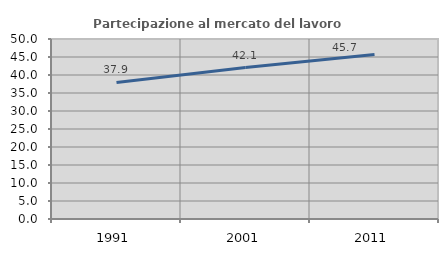
| Category | Partecipazione al mercato del lavoro  femminile |
|---|---|
| 1991.0 | 37.917 |
| 2001.0 | 42.06 |
| 2011.0 | 45.675 |